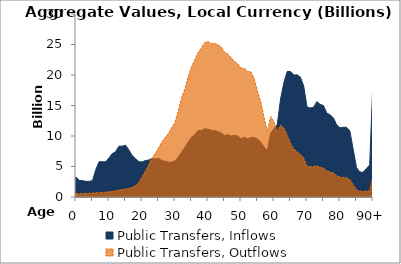
| Category | Public Transfers, Inflows | Public Transfers, Outflows |
|---|---|---|
| 0 | 3284.126 | 535.401 |
|  | 2700.48 | 528.578 |
| 2 | 2686.418 | 537.624 |
| 3 | 2566.035 | 598.725 |
| 4 | 2568.289 | 605.79 |
| 5 | 2681.075 | 634.073 |
| 6 | 4497.635 | 682.326 |
| 7 | 5787.675 | 700.599 |
| 8 | 5769.141 | 718.295 |
| 9 | 5761.788 | 785.154 |
| 10 | 6410.958 | 856.348 |
| 11 | 7116.054 | 919.655 |
| 12 | 7425.853 | 1001.362 |
| 13 | 8320.602 | 1159.01 |
| 14 | 8333.461 | 1205.822 |
| 15 | 8492.937 | 1319.151 |
| 16 | 7742.693 | 1397.898 |
| 17 | 6815.891 | 1563.295 |
| 18 | 6302.884 | 1839.724 |
| 19 | 5819.517 | 2358.38 |
| 20 | 5727.674 | 3246.718 |
| 21 | 5971.61 | 4223.471 |
| 22 | 6054.228 | 5231.351 |
| 23 | 6293.199 | 6399.088 |
| 24 | 6249.099 | 7129.2 |
| 25 | 6327.07 | 8061.391 |
| 26 | 5971.25 | 8983.007 |
| 27 | 5868.893 | 9773.843 |
| 28 | 5694.823 | 10390.019 |
| 29 | 5739.021 | 11352.245 |
| 30 | 5881.477 | 12218.695 |
| 31 | 6531.823 | 14116.231 |
| 32 | 7360.791 | 16286.357 |
| 33 | 8141.118 | 17701.265 |
| 34 | 9000.656 | 19685.798 |
| 35 | 9777.51 | 21357.488 |
| 36 | 10221.593 | 22511.902 |
| 37 | 10914.017 | 23687.471 |
| 38 | 10882.437 | 24401.05 |
| 39 | 11195.077 | 25311.661 |
| 40 | 11097.981 | 25476.332 |
| 41 | 10923.887 | 25130.738 |
| 42 | 10876.817 | 25165.329 |
| 43 | 10714.629 | 24977.609 |
| 44 | 10497.485 | 24594.065 |
| 45 | 10058.876 | 23746.034 |
| 46 | 10248.986 | 23447.731 |
| 47 | 10002.952 | 22858.868 |
| 48 | 10095.054 | 22204.222 |
| 49 | 9990.045 | 21848.595 |
| 50 | 9535.729 | 21111.497 |
| 51 | 9795.772 | 21110.231 |
| 52 | 9508.091 | 20583.997 |
| 53 | 9770.468 | 20511.675 |
| 54 | 9725.782 | 19396.484 |
| 55 | 9523.06 | 17345.164 |
| 56 | 8978.202 | 15608.842 |
| 57 | 8162.745 | 13002.651 |
| 58 | 7646.47 | 10764.109 |
| 59 | 10517.474 | 13195.62 |
| 60 | 11180.74 | 12276.332 |
| 61 | 11910.706 | 10810.26 |
| 62 | 16085.787 | 11765.522 |
| 63 | 18769.283 | 11297.152 |
| 64 | 20574.878 | 10127.963 |
| 65 | 20574.785 | 8813.504 |
| 66 | 19996.609 | 7850.806 |
| 67 | 20032.174 | 7399.67 |
| 68 | 19652.133 | 6979.422 |
| 69 | 18176.676 | 6372.587 |
| 70 | 14746.749 | 5051.29 |
| 71 | 14605.553 | 4949.007 |
| 72 | 14703.152 | 4947.571 |
| 73 | 15643.828 | 5119.25 |
| 74 | 15173.79 | 4860.508 |
| 75 | 14985.126 | 4717.196 |
| 76 | 13747.871 | 4284.678 |
| 77 | 13469.64 | 4078.762 |
| 78 | 12964.374 | 3906.868 |
| 79 | 11818.351 | 3487.078 |
| 80 | 11333 | 3252.772 |
| 81 | 11436.888 | 3205.011 |
| 82 | 11414.057 | 3135.354 |
| 83 | 10825.897 | 2852.332 |
| 84 | 7773.194 | 1985.656 |
| 85 | 4830.284 | 1162.402 |
| 86 | 4099.506 | 948.468 |
| 87 | 4058.626 | 885.833 |
| 88 | 4668.552 | 954.611 |
| 89 | 5269.357 | 1027.643 |
| 90+ | 19293.772 | 3513.905 |